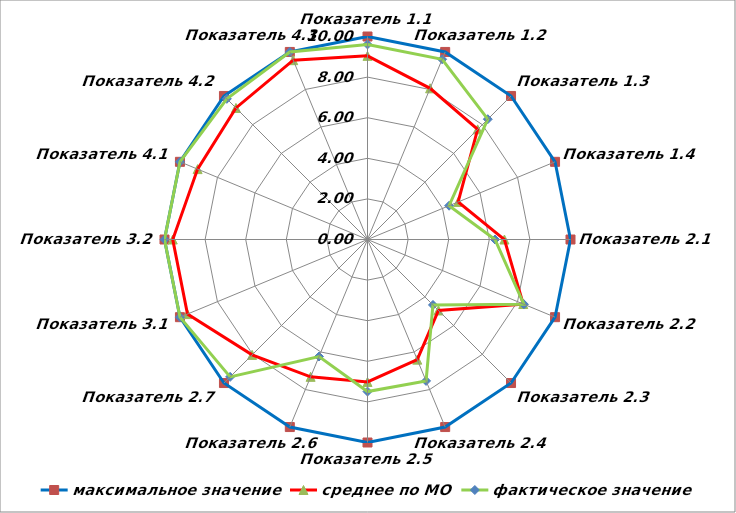
| Category | максимальное значение | среднее по МО | фактическое значение |
|---|---|---|---|
| Показатель 1.1 | 10 | 9.046 | 9.61 |
| Показатель 1.2 | 10 | 8.061 | 9.61 |
| Показатель 1.3 | 10 | 7.673 | 8.38 |
| Показатель 1.4 | 10 | 4.833 | 4.35 |
| Показатель 2.1 | 10 | 6.745 | 6.28 |
| Показатель 2.2 | 10 | 8.305 | 8.34 |
| Показатель 2.3 | 10 | 4.943 | 4.56 |
| Показатель 2.4 | 10 | 6.405 | 7.54 |
| Показатель 2.5 | 10 | 7.017 | 7.49 |
| Показатель 2.6 | 10 | 7.323 | 6.24 |
| Показатель 2.7 | 10 | 8.039 | 9.57 |
| Показатель 3.1 | 10 | 9.599 | 10 |
| Показатель 3.2 | 10 | 9.593 | 10 |
| Показатель 4.1 | 10 | 9.059 | 10 |
| Показатель 4.2 | 10 | 9.164 | 9.8 |
| Показатель 4.3 | 10 | 9.561 | 10 |